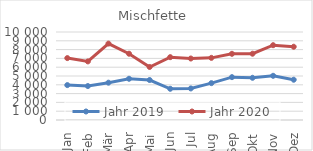
| Category | Jahr 2019 | Jahr 2020 |
|---|---|---|
| Jan | 3966 | 7034 |
| Feb | 3858 | 6659 |
| Mär | 4241 | 8682 |
| Apr | 4686 | 7532 |
| Mai | 4544 | 6025 |
| Jun | 3548 | 7140 |
| Jul | 3585 | 6987 |
| Aug | 4188 | 7062 |
| Sep | 4871 | 7522 |
| Okt | 4796 | 7532 |
| Nov | 5023 | 8501 |
| Dez | 4576 | 8324 |